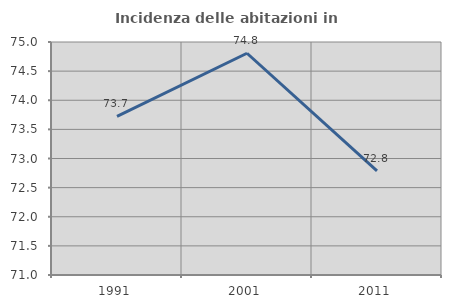
| Category | Incidenza delle abitazioni in proprietà  |
|---|---|
| 1991.0 | 73.723 |
| 2001.0 | 74.807 |
| 2011.0 | 72.786 |